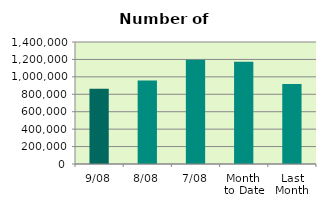
| Category | Series 0 |
|---|---|
| 9/08 | 864532 |
| 8/08 | 957542 |
| 7/08 | 1196556 |
| Month 
to Date | 1173136 |
| Last
Month | 919173.478 |